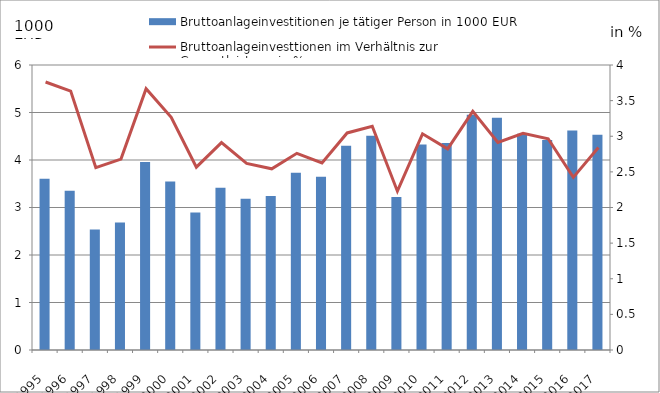
| Category | Bruttoanlageinvestitionen je tätiger Person in 1000 EUR |
|---|---|
| 1995.0 | 3.607 |
| 1996.0 | 3.355 |
| 1997.0 | 2.538 |
| 1998.0 | 2.683 |
| 1999.0 | 3.96 |
| 2000.0 | 3.549 |
| 2001.0 | 2.897 |
| 2002.0 | 3.414 |
| 2003.0 | 3.186 |
| 2004.0 | 3.244 |
| 2005.0 | 3.734 |
| 2006.0 | 3.649 |
| 2007.0 | 4.3 |
| 2008.0 | 4.51 |
| 2009.0 | 3.22 |
| 2010.0 | 4.327 |
| 2011.0 | 4.357 |
| 2012.0 | 4.955 |
| 2013.0 | 4.887 |
| 2014.0 | 4.555 |
| 2015.0 | 4.422 |
| 2016.0 | 4.62 |
| 2017.0 | 4.529 |